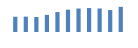
| Category | Exportações (1) |
|---|---|
| 0 | 203692.629 |
| 1 | 204985.899 |
| 2 | 199789.293 |
| 3 | 228223.553 |
| 4 | 265930.688 |
| 5 | 297477.923 |
| 6 | 313201.621 |
| 7 | 319331.634 |
| 8 | 313646.514 |
| 9 | 292733.264 |
| 10 | 336060.607 |